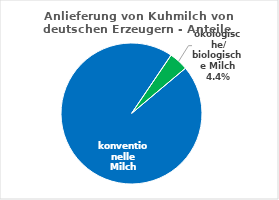
| Category | Anlieferung von Kuhmilch von deutschen Erzeugern - Anteile 2024 |
|---|---|
| konventionelle Milch | 0.956 |
| ökologische/ biologische Milch | 0.044 |